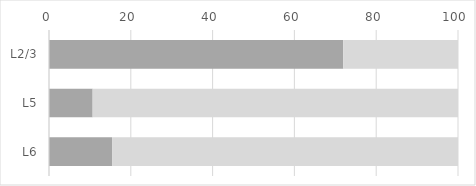
| Category | Series 0 | Series 1 |
|---|---|---|
| L2/3 | 71.946 | 28.054 |
| L5 | 10.669 | 89.331 |
| L6 | 15.424 | 84.576 |